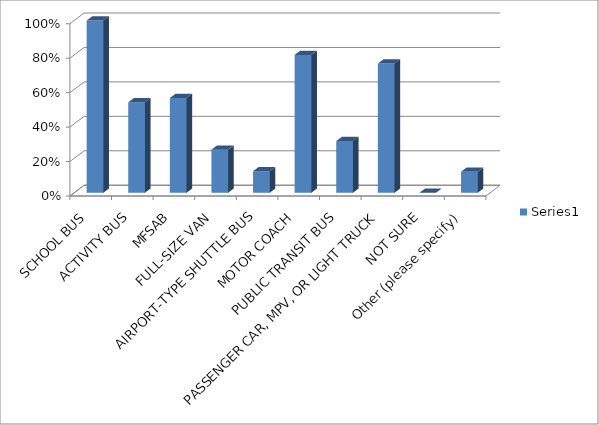
| Category | Series 0 |
|---|---|
| SCHOOL BUS | 1 |
| ACTIVITY BUS | 0.525 |
| MFSAB | 0.55 |
| FULL-SIZE VAN | 0.25 |
| AIRPORT-TYPE SHUTTLE BUS | 0.125 |
| MOTOR COACH | 0.8 |
| PUBLIC TRANSIT BUS | 0.3 |
| PASSENGER CAR, MPV, OR LIGHT TRUCK | 0.75 |
| NOT SURE | 0 |
| Other (please specify) | 0.122 |